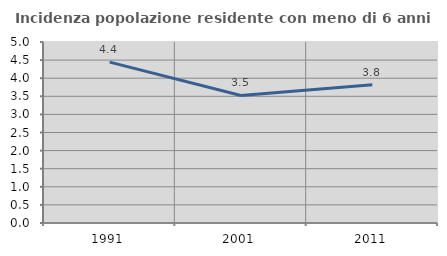
| Category | Incidenza popolazione residente con meno di 6 anni |
|---|---|
| 1991.0 | 4.444 |
| 2001.0 | 3.523 |
| 2011.0 | 3.82 |